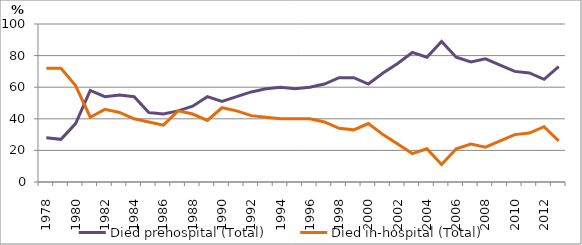
| Category | Died prehospital (Total) | Died in-hospital (Total) |
|---|---|---|
| 1978.0 | 28 | 72 |
| 1979.0 | 27 | 72 |
| 1980.0 | 37 | 61 |
| 1981.0 | 58 | 41 |
| 1982.0 | 54 | 46 |
| 1983.0 | 55 | 44 |
| 1984.0 | 54 | 40 |
| 1985.0 | 44 | 38 |
| 1986.0 | 43 | 36 |
| 1987.0 | 45 | 45 |
| 1988.0 | 48 | 43 |
| 1989.0 | 54 | 39 |
| 1990.0 | 51 | 47 |
| 1991.0 | 54 | 45 |
| 1992.0 | 57 | 42 |
| 1993.0 | 59 | 41 |
| 1994.0 | 60 | 40 |
| 1995.0 | 59 | 40 |
| 1996.0 | 60 | 40 |
| 1997.0 | 62 | 38 |
| 1998.0 | 66 | 34 |
| 1999.0 | 66 | 33 |
| 2000.0 | 62 | 37 |
| 2001.0 | 69 | 30 |
| 2002.0 | 75 | 24 |
| 2003.0 | 82 | 18 |
| 2004.0 | 79 | 21 |
| 2005.0 | 89 | 11 |
| 2006.0 | 79 | 21 |
| 2007.0 | 76 | 24 |
| 2008.0 | 78 | 22 |
| 2009.0 | 74 | 26 |
| 2010.0 | 70 | 30 |
| 2011.0 | 69 | 31 |
| 2012.0 | 65 | 35 |
| 2013.0 | 73 | 26 |